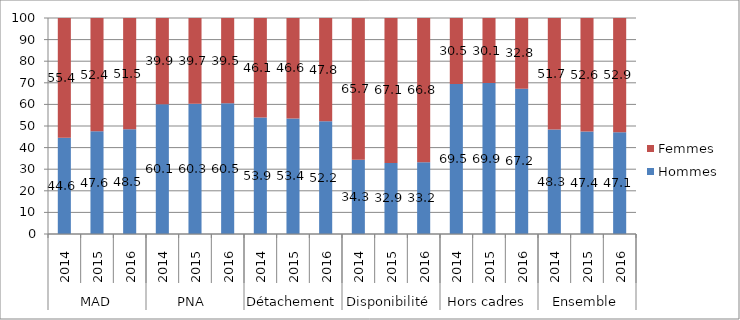
| Category | Hommes  | Femmes  |
|---|---|---|
| 0 | 44.553 | 55.447 |
| 1 | 47.623 | 52.377 |
| 2 | 48.51 | 51.49 |
| 3 | 60.1 | 39.9 |
| 4 | 60.3 | 39.7 |
| 5 | 60.5 | 39.5 |
| 6 | 53.945 | 46.055 |
| 7 | 53.435 | 46.565 |
| 8 | 52.21 | 47.79 |
| 9 | 34.326 | 65.674 |
| 10 | 32.909 | 67.091 |
| 11 | 33.18 | 66.82 |
| 12 | 69.459 | 30.541 |
| 13 | 69.859 | 30.141 |
| 14 | 67.24 | 32.76 |
| 15 | 48.341 | 51.659 |
| 16 | 47.397 | 52.603 |
| 17 | 47.1 | 52.9 |